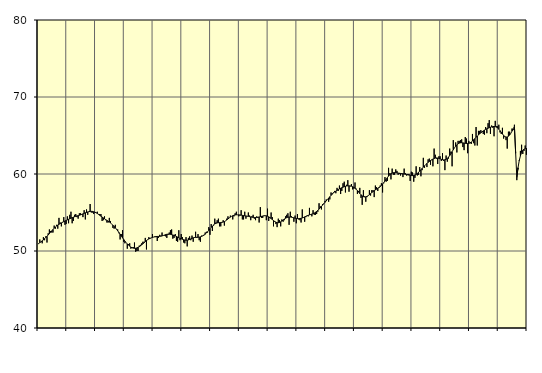
| Category | Samtliga sysselsatta (inkl. sysselsatta utomlands) | Series 1 |
|---|---|---|
| nan | 50.9 | 50.97 |
| 87.0 | 51.5 | 51.09 |
| 87.0 | 51.2 | 51.19 |
| 87.0 | 51 | 51.32 |
| 87.0 | 51.8 | 51.45 |
| 87.0 | 51.4 | 51.59 |
| 87.0 | 51.9 | 51.75 |
| 87.0 | 51.1 | 51.91 |
| 87.0 | 52.3 | 52.08 |
| 87.0 | 52.8 | 52.25 |
| 87.0 | 52.6 | 52.44 |
| 87.0 | 52.4 | 52.62 |
| nan | 52.4 | 52.79 |
| 88.0 | 53.3 | 52.96 |
| 88.0 | 52.9 | 53.12 |
| 88.0 | 53.4 | 53.25 |
| 88.0 | 52.9 | 53.37 |
| 88.0 | 54.3 | 53.47 |
| 88.0 | 53.7 | 53.56 |
| 88.0 | 53.2 | 53.65 |
| 88.0 | 53.7 | 53.74 |
| 88.0 | 54.4 | 53.82 |
| 88.0 | 53.4 | 53.89 |
| 88.0 | 53.5 | 53.97 |
| nan | 54.5 | 54.04 |
| 89.0 | 53.6 | 54.12 |
| 89.0 | 54.7 | 54.19 |
| 89.0 | 55.1 | 54.26 |
| 89.0 | 53.6 | 54.33 |
| 89.0 | 53.9 | 54.39 |
| 89.0 | 54.7 | 54.45 |
| 89.0 | 54.8 | 54.5 |
| 89.0 | 54.4 | 54.55 |
| 89.0 | 54.2 | 54.59 |
| 89.0 | 54.9 | 54.64 |
| 89.0 | 54.9 | 54.69 |
| nan | 54.8 | 54.76 |
| 90.0 | 54.4 | 54.82 |
| 90.0 | 55.3 | 54.89 |
| 90.0 | 54.1 | 54.96 |
| 90.0 | 55.4 | 55.01 |
| 90.0 | 54.7 | 55.07 |
| 90.0 | 55.1 | 55.11 |
| 90.0 | 56.1 | 55.14 |
| 90.0 | 55 | 55.15 |
| 90.0 | 55 | 55.14 |
| 90.0 | 54.8 | 55.1 |
| 90.0 | 55 | 55.05 |
| nan | 55 | 54.97 |
| 91.0 | 55.1 | 54.87 |
| 91.0 | 54.8 | 54.76 |
| 91.0 | 54.8 | 54.64 |
| 91.0 | 54.8 | 54.52 |
| 91.0 | 53.9 | 54.41 |
| 91.0 | 54 | 54.3 |
| 91.0 | 54.5 | 54.19 |
| 91.0 | 54 | 54.07 |
| 91.0 | 53.7 | 53.97 |
| 91.0 | 53.7 | 53.87 |
| 91.0 | 54.3 | 53.76 |
| nan | 53.9 | 53.64 |
| 92.0 | 53.5 | 53.5 |
| 92.0 | 53 | 53.35 |
| 92.0 | 52.9 | 53.19 |
| 92.0 | 53.4 | 53.01 |
| 92.0 | 52.8 | 52.82 |
| 92.0 | 52.8 | 52.62 |
| 92.0 | 52.3 | 52.41 |
| 92.0 | 51.5 | 52.19 |
| 92.0 | 52.2 | 51.95 |
| 92.0 | 52.7 | 51.72 |
| 92.0 | 51.2 | 51.5 |
| nan | 51 | 51.28 |
| 93.0 | 51.1 | 51.09 |
| 93.0 | 50.3 | 50.92 |
| 93.0 | 50.9 | 50.76 |
| 93.0 | 51 | 50.63 |
| 93.0 | 50.3 | 50.51 |
| 93.0 | 50.5 | 50.42 |
| 93.0 | 50.5 | 50.37 |
| 93.0 | 51.1 | 50.35 |
| 93.0 | 49.9 | 50.36 |
| 93.0 | 50 | 50.4 |
| 93.0 | 50 | 50.47 |
| nan | 50.7 | 50.55 |
| 94.0 | 50.8 | 50.66 |
| 94.0 | 51 | 50.79 |
| 94.0 | 51.2 | 50.93 |
| 94.0 | 51.2 | 51.08 |
| 94.0 | 51.7 | 51.22 |
| 94.0 | 50.2 | 51.36 |
| 94.0 | 51.5 | 51.47 |
| 94.0 | 51.8 | 51.57 |
| 94.0 | 51.6 | 51.64 |
| 94.0 | 51.7 | 51.71 |
| 94.0 | 52.2 | 51.76 |
| nan | 51.8 | 51.81 |
| 95.0 | 51.9 | 51.84 |
| 95.0 | 51.8 | 51.87 |
| 95.0 | 51.3 | 51.89 |
| 95.0 | 51.7 | 51.89 |
| 95.0 | 52.1 | 51.9 |
| 95.0 | 52 | 51.92 |
| 95.0 | 52.4 | 51.96 |
| 95.0 | 52 | 52.01 |
| 95.0 | 52 | 52.07 |
| 95.0 | 51.9 | 52.13 |
| 95.0 | 51.7 | 52.17 |
| nan | 52.1 | 52.18 |
| 96.0 | 52.4 | 52.18 |
| 96.0 | 52.7 | 52.16 |
| 96.0 | 52.8 | 52.12 |
| 96.0 | 51.6 | 52.08 |
| 96.0 | 51.7 | 52.03 |
| 96.0 | 52.2 | 51.97 |
| 96.0 | 51.3 | 51.89 |
| 96.0 | 51.2 | 51.81 |
| 96.0 | 52.7 | 51.72 |
| 96.0 | 51.4 | 51.64 |
| 96.0 | 52.2 | 51.58 |
| nan | 51.8 | 51.52 |
| 97.0 | 51.1 | 51.47 |
| 97.0 | 51 | 51.42 |
| 97.0 | 51.8 | 51.4 |
| 97.0 | 50.6 | 51.4 |
| 97.0 | 51.7 | 51.44 |
| 97.0 | 51.9 | 51.5 |
| 97.0 | 51.4 | 51.57 |
| 97.0 | 52 | 51.65 |
| 97.0 | 51.2 | 51.71 |
| 97.0 | 51.7 | 51.75 |
| 97.0 | 52.5 | 51.77 |
| nan | 51.7 | 51.78 |
| 98.0 | 52.2 | 51.79 |
| 98.0 | 51.4 | 51.8 |
| 98.0 | 51.2 | 51.84 |
| 98.0 | 52 | 51.89 |
| 98.0 | 52 | 51.97 |
| 98.0 | 52.1 | 52.06 |
| 98.0 | 52.4 | 52.18 |
| 98.0 | 52.5 | 52.33 |
| 98.0 | 52.4 | 52.5 |
| 98.0 | 53.1 | 52.69 |
| 98.0 | 52.1 | 52.88 |
| nan | 53.5 | 53.07 |
| 99.0 | 52.6 | 53.24 |
| 99.0 | 53.3 | 53.39 |
| 99.0 | 54.2 | 53.51 |
| 99.0 | 53.7 | 53.6 |
| 99.0 | 54 | 53.65 |
| 99.0 | 54.2 | 53.67 |
| 99.0 | 53.2 | 53.68 |
| 99.0 | 53.2 | 53.7 |
| 99.0 | 53.7 | 53.72 |
| 99.0 | 54 | 53.76 |
| 99.0 | 53.3 | 53.82 |
| nan | 53.9 | 53.91 |
| 0.0 | 54.2 | 54.03 |
| 0.0 | 54.5 | 54.16 |
| 0.0 | 54.3 | 54.29 |
| 0.0 | 54.6 | 54.4 |
| 0.0 | 54.5 | 54.5 |
| 0.0 | 54.1 | 54.58 |
| 0.0 | 54.5 | 54.64 |
| 0.0 | 54.9 | 54.68 |
| 0.0 | 55.1 | 54.7 |
| 0.0 | 54.7 | 54.7 |
| 0.0 | 54.5 | 54.7 |
| nan | 54.6 | 54.68 |
| 1.0 | 55.3 | 54.66 |
| 1.0 | 54.1 | 54.63 |
| 1.0 | 54.1 | 54.6 |
| 1.0 | 55.1 | 54.57 |
| 1.0 | 54.2 | 54.55 |
| 1.0 | 54.5 | 54.52 |
| 1.0 | 55 | 54.5 |
| 1.0 | 54.6 | 54.46 |
| 1.0 | 54 | 54.43 |
| 1.0 | 54.5 | 54.4 |
| 1.0 | 54.7 | 54.37 |
| nan | 54.2 | 54.35 |
| 2.0 | 54 | 54.35 |
| 2.0 | 54.5 | 54.36 |
| 2.0 | 54.3 | 54.38 |
| 2.0 | 53.7 | 54.42 |
| 2.0 | 55.7 | 54.46 |
| 2.0 | 54.3 | 54.5 |
| 2.0 | 54.3 | 54.54 |
| 2.0 | 54.6 | 54.57 |
| 2.0 | 54.6 | 54.59 |
| 2.0 | 54 | 54.57 |
| 2.0 | 55.5 | 54.52 |
| nan | 53.9 | 54.44 |
| 3.0 | 54.4 | 54.33 |
| 3.0 | 55 | 54.21 |
| 3.0 | 54.4 | 54.08 |
| 3.0 | 53.2 | 53.95 |
| 3.0 | 53.9 | 53.83 |
| 3.0 | 53.5 | 53.74 |
| 3.0 | 53.1 | 53.68 |
| 3.0 | 54.2 | 53.67 |
| 3.0 | 54 | 53.71 |
| 3.0 | 53.2 | 53.79 |
| 3.0 | 54.1 | 53.9 |
| nan | 53.8 | 54.02 |
| 4.0 | 54 | 54.15 |
| 4.0 | 54.5 | 54.25 |
| 4.0 | 54.7 | 54.33 |
| 4.0 | 54.9 | 54.39 |
| 4.0 | 53.4 | 54.41 |
| 4.0 | 55.1 | 54.41 |
| 4.0 | 54.5 | 54.39 |
| 4.0 | 54.3 | 54.35 |
| 4.0 | 53.8 | 54.31 |
| 4.0 | 54.6 | 54.26 |
| 4.0 | 53.6 | 54.23 |
| nan | 54.8 | 54.21 |
| 5.0 | 54.1 | 54.2 |
| 5.0 | 54 | 54.22 |
| 5.0 | 53.7 | 54.24 |
| 5.0 | 55.4 | 54.29 |
| 5.0 | 54.3 | 54.35 |
| 5.0 | 53.8 | 54.43 |
| 5.0 | 54.4 | 54.5 |
| 5.0 | 54.6 | 54.57 |
| 5.0 | 54.5 | 54.63 |
| 5.0 | 55.6 | 54.69 |
| 5.0 | 54.7 | 54.74 |
| nan | 54.5 | 54.8 |
| 6.0 | 55.3 | 54.86 |
| 6.0 | 54.7 | 54.93 |
| 6.0 | 54.7 | 55.03 |
| 6.0 | 54.8 | 55.14 |
| 6.0 | 55.1 | 55.28 |
| 6.0 | 56.2 | 55.43 |
| 6.0 | 55.8 | 55.61 |
| 6.0 | 55.4 | 55.79 |
| 6.0 | 56.1 | 55.97 |
| 6.0 | 56.1 | 56.16 |
| 6.0 | 56.5 | 56.33 |
| nan | 56.7 | 56.51 |
| 7.0 | 56.7 | 56.69 |
| 7.0 | 56.4 | 56.87 |
| 7.0 | 56.7 | 57.05 |
| 7.0 | 57.6 | 57.22 |
| 7.0 | 57.5 | 57.39 |
| 7.0 | 57.6 | 57.54 |
| 7.0 | 57.8 | 57.66 |
| 7.0 | 57.5 | 57.78 |
| 7.0 | 58.2 | 57.88 |
| 7.0 | 57.8 | 57.98 |
| 7.0 | 58.5 | 58.07 |
| nan | 57.4 | 58.15 |
| 8.0 | 57.8 | 58.22 |
| 8.0 | 58.8 | 58.29 |
| 8.0 | 59 | 58.35 |
| 8.0 | 57.6 | 58.4 |
| 8.0 | 58.6 | 58.44 |
| 8.0 | 59.2 | 58.46 |
| 8.0 | 57.7 | 58.46 |
| 8.0 | 58.4 | 58.45 |
| 8.0 | 58.7 | 58.42 |
| 8.0 | 58 | 58.35 |
| 8.0 | 58.1 | 58.27 |
| nan | 58.9 | 58.15 |
| 9.0 | 58.1 | 58.01 |
| 9.0 | 57.4 | 57.84 |
| 9.0 | 57.8 | 57.65 |
| 9.0 | 58.2 | 57.46 |
| 9.0 | 56.9 | 57.3 |
| 9.0 | 56 | 57.16 |
| 9.0 | 57.9 | 57.06 |
| 9.0 | 57.1 | 57.02 |
| 9.0 | 56.4 | 57.03 |
| 9.0 | 57 | 57.09 |
| 9.0 | 57.2 | 57.19 |
| nan | 57.9 | 57.31 |
| 10.0 | 57.2 | 57.45 |
| 10.0 | 57.9 | 57.59 |
| 10.0 | 57.9 | 57.72 |
| 10.0 | 57 | 57.83 |
| 10.0 | 58.5 | 57.94 |
| 10.0 | 58.3 | 58.03 |
| 10.0 | 57.8 | 58.13 |
| 10.0 | 58.3 | 58.23 |
| 10.0 | 58.5 | 58.36 |
| 10.0 | 58.8 | 58.52 |
| 10.0 | 57.6 | 58.7 |
| nan | 58.8 | 58.88 |
| 11.0 | 59.6 | 59.09 |
| 11.0 | 59 | 59.31 |
| 11.0 | 59.1 | 59.53 |
| 11.0 | 60.8 | 59.73 |
| 11.0 | 60.1 | 59.9 |
| 11.0 | 59.3 | 60.04 |
| 11.0 | 60.7 | 60.12 |
| 11.0 | 59.9 | 60.17 |
| 11.0 | 59.9 | 60.18 |
| 11.0 | 60.6 | 60.17 |
| 11.0 | 60.4 | 60.15 |
| nan | 59.9 | 60.12 |
| 12.0 | 60 | 60.1 |
| 12.0 | 59.8 | 60.07 |
| 12.0 | 60.1 | 60.05 |
| 12.0 | 59.6 | 60.03 |
| 12.0 | 60.7 | 60 |
| 12.0 | 60.1 | 59.96 |
| 12.0 | 59.8 | 59.93 |
| 12.0 | 60 | 59.89 |
| 12.0 | 60 | 59.86 |
| 12.0 | 59.1 | 59.83 |
| 12.0 | 60.3 | 59.8 |
| nan | 60.2 | 59.79 |
| 13.0 | 59 | 59.82 |
| 13.0 | 59.5 | 59.87 |
| 13.0 | 61 | 59.95 |
| 13.0 | 59.8 | 60.07 |
| 13.0 | 59.9 | 60.21 |
| 13.0 | 60.9 | 60.38 |
| 13.0 | 59.7 | 60.55 |
| 13.0 | 60.5 | 60.73 |
| 13.0 | 62.1 | 60.89 |
| 13.0 | 60.8 | 61.06 |
| 13.0 | 61.2 | 61.22 |
| nan | 60.9 | 61.37 |
| 14.0 | 61.9 | 61.51 |
| 14.0 | 62 | 61.63 |
| 14.0 | 61.2 | 61.75 |
| 14.0 | 61.8 | 61.85 |
| 14.0 | 61 | 61.94 |
| 14.0 | 63.3 | 62.01 |
| 14.0 | 62.5 | 62.07 |
| 14.0 | 62 | 62.09 |
| 14.0 | 61.3 | 62.07 |
| 14.0 | 62.3 | 62.03 |
| 14.0 | 62.3 | 61.98 |
| nan | 61.7 | 61.91 |
| 15.0 | 62.7 | 61.86 |
| 15.0 | 61.7 | 61.83 |
| 15.0 | 60.5 | 61.84 |
| 15.0 | 62.4 | 61.91 |
| 15.0 | 61.6 | 62.03 |
| 15.0 | 62 | 62.19 |
| 15.0 | 63.3 | 62.39 |
| 15.0 | 62.9 | 62.63 |
| 15.0 | 61 | 62.89 |
| 15.0 | 64.4 | 63.16 |
| 15.0 | 63.4 | 63.4 |
| nan | 64.1 | 63.62 |
| 16.0 | 62.8 | 63.79 |
| 16.0 | 64.3 | 63.92 |
| 16.0 | 64.3 | 64.01 |
| 16.0 | 64.4 | 64.05 |
| 16.0 | 64.5 | 64.06 |
| 16.0 | 63.5 | 64.04 |
| 16.0 | 63.1 | 64.01 |
| 16.0 | 64.8 | 63.98 |
| 16.0 | 64.6 | 63.96 |
| 16.0 | 62.7 | 63.97 |
| 16.0 | 64.3 | 63.99 |
| nan | 64 | 64.05 |
| 17.0 | 63.9 | 64.15 |
| 17.0 | 65.2 | 64.29 |
| 17.0 | 64 | 64.44 |
| 17.0 | 63.7 | 64.61 |
| 17.0 | 66.1 | 64.76 |
| 17.0 | 63.7 | 64.92 |
| 17.0 | 65.6 | 65.07 |
| 17.0 | 65.6 | 65.21 |
| 17.0 | 65.7 | 65.35 |
| 17.0 | 65.5 | 65.47 |
| 17.0 | 65.2 | 65.6 |
| nan | 65.1 | 65.7 |
| 18.0 | 66.1 | 65.8 |
| 18.0 | 65.3 | 65.87 |
| 18.0 | 66.6 | 65.95 |
| 18.0 | 67 | 66.01 |
| 18.0 | 65.2 | 66.07 |
| 18.0 | 66.3 | 66.12 |
| 18.0 | 66 | 66.16 |
| 18.0 | 64.9 | 66.17 |
| 18.0 | 66.9 | 66.15 |
| 18.0 | 66.2 | 66.08 |
| 18.0 | 66.2 | 65.97 |
| nan | 66.4 | 65.82 |
| 19.0 | 65.4 | 65.63 |
| 19.0 | 65.2 | 65.42 |
| 19.0 | 66 | 65.2 |
| 19.0 | 64.6 | 65.01 |
| 19.0 | 64.8 | 64.86 |
| 19.0 | 64.4 | 64.79 |
| 19.0 | 63.3 | 64.81 |
| 19.0 | 65.5 | 64.9 |
| 19.0 | 65.5 | 65.06 |
| 19.0 | 65.3 | 65.29 |
| 19.0 | 65.9 | 65.57 |
| nan | 65.7 | 65.87 |
| 20.0 | 66.4 | 66.18 |
| 20.0 | 62.7 | 62.83 |
| 20.0 | 59.2 | 59.52 |
| 20.0 | 60.6 | 60.81 |
| 20.0 | 61.8 | 61.72 |
| 20.0 | 63 | 62.36 |
| 20.0 | 63.8 | 62.79 |
| 20.0 | 62.6 | 63.07 |
| 20.0 | 63 | 63.23 |
| 20.0 | 63.7 | 63.32 |
| 20.0 | 62.5 | 63.36 |